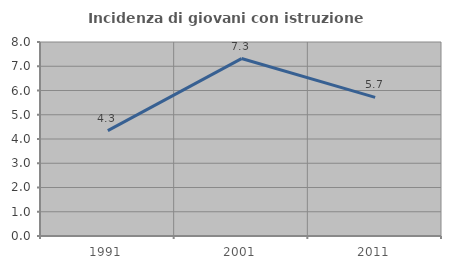
| Category | Incidenza di giovani con istruzione universitaria |
|---|---|
| 1991.0 | 4.348 |
| 2001.0 | 7.317 |
| 2011.0 | 5.714 |